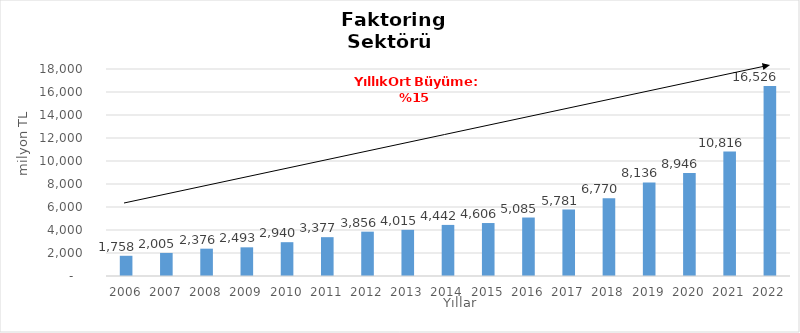
| Category | Faktoring  |
|---|---|
| 2006.0 | 1757.796 |
| 2007.0 | 2005.232 |
| 2008.0 | 2375.996 |
| 2009.0 | 2493.335 |
| 2010.0 | 2940.32 |
| 2011.0 | 3376.552 |
| 2012.0 | 3855.882 |
| 2013.0 | 4014.568 |
| 2014.0 | 4442 |
| 2015.0 | 4606 |
| 2016.0 | 5085 |
| 2017.0 | 5781 |
| 2018.0 | 6770 |
| 2019.0 | 8136 |
| 2020.0 | 8946 |
| 2021.0 | 10816 |
| 2022.0 | 16526 |